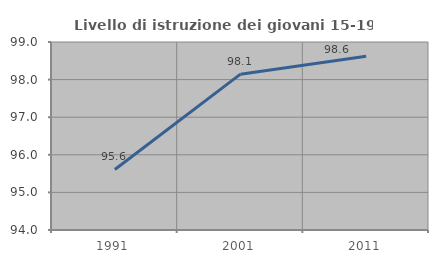
| Category | Livello di istruzione dei giovani 15-19 anni |
|---|---|
| 1991.0 | 95.611 |
| 2001.0 | 98.144 |
| 2011.0 | 98.622 |